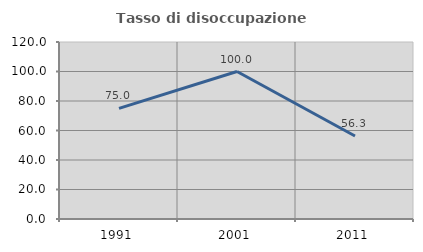
| Category | Tasso di disoccupazione giovanile  |
|---|---|
| 1991.0 | 75 |
| 2001.0 | 100 |
| 2011.0 | 56.25 |